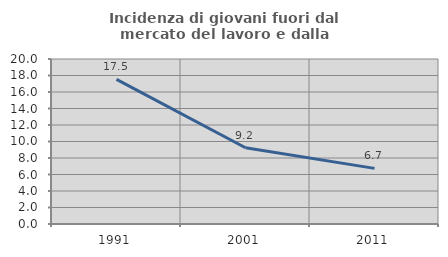
| Category | Incidenza di giovani fuori dal mercato del lavoro e dalla formazione  |
|---|---|
| 1991.0 | 17.526 |
| 2001.0 | 9.239 |
| 2011.0 | 6.742 |